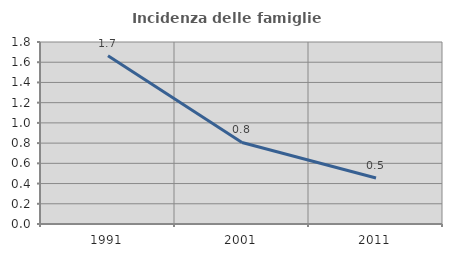
| Category | Incidenza delle famiglie numerose |
|---|---|
| 1991.0 | 1.665 |
| 2001.0 | 0.806 |
| 2011.0 | 0.455 |